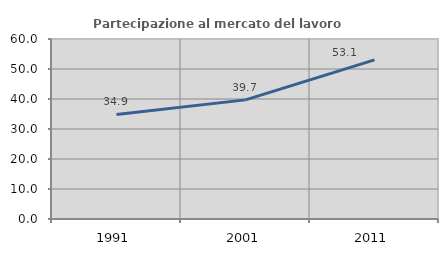
| Category | Partecipazione al mercato del lavoro  femminile |
|---|---|
| 1991.0 | 34.858 |
| 2001.0 | 39.71 |
| 2011.0 | 53.057 |